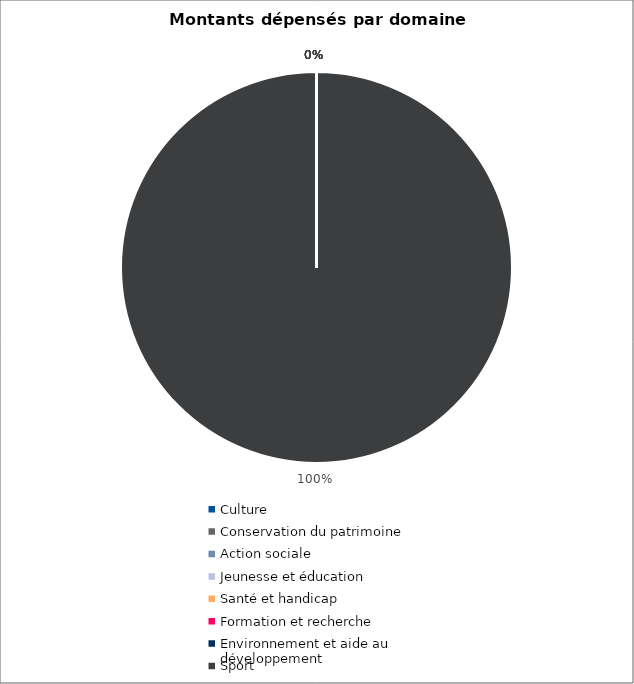
| Category | Series 0 |
|---|---|
| Culture | 0 |
| Conservation du patrimoine | 0 |
| Action sociale | 0 |
| Jeunesse et éducation | 0 |
| Santé et handicap | 0 |
| Formation et recherche | 0 |
| Environnement et aide au
développement | 0 |
| Sport | 4022820.8 |
| Autres projets d’utilité publique | 0 |